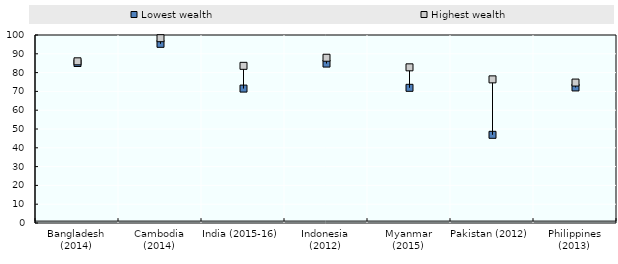
| Category | Lowest wealth | Highest wealth |
|---|---|---|
| Bangladesh (2014) | 85.1 | 86 |
| Cambodia (2014) | 95.3 | 98.3 |
| India (2015-16) | 71.5 | 83.6 |
| Indonesia (2012) | 84.8 | 87.9 |
| Myanmar (2015) | 71.9 | 82.8 |
| Pakistan (2012) | 46.9 | 76.4 |
| Philippines (2013) | 72.1 | 74.7 |